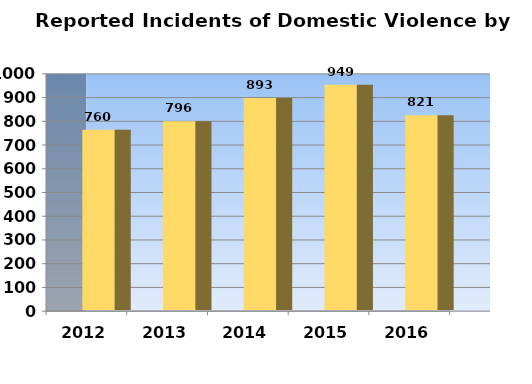
| Category | Series 0 |
|---|---|
| 2012.0 | 760 |
| 2013.0 | 796 |
| 2014.0 | 893 |
| 2015.0 | 949 |
| 2016.0 | 821 |